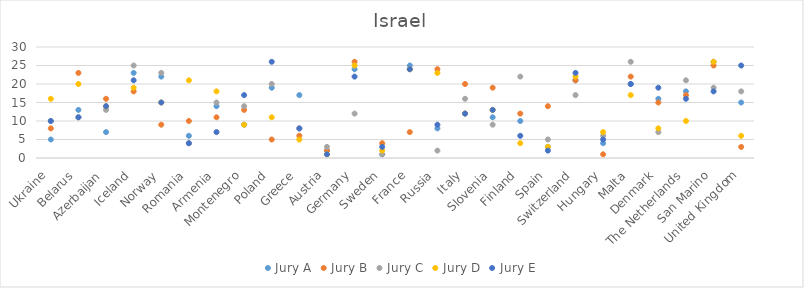
| Category | Jury A | Jury B | Jury C | Jury D | Jury E |
|---|---|---|---|---|---|
| Ukraine | 5 | 8 | 10 | 16 | 10 |
| Belarus | 13 | 23 | 11 | 20 | 11 |
| Azerbaijan | 7 | 16 | 13 | 14 | 14 |
| Iceland | 23 | 18 | 25 | 19 | 21 |
| Norway | 22 | 9 | 23 | 15 | 15 |
| Romania | 6 | 10 | 4 | 21 | 4 |
| Armenia | 14 | 11 | 15 | 18 | 7 |
| Montenegro | 9 | 13 | 14 | 9 | 17 |
| Poland | 19 | 5 | 20 | 11 | 26 |
| Greece | 17 | 6 | 8 | 5 | 8 |
| Austria | 2 | 2 | 3 | 1 | 1 |
| Germany | 24 | 26 | 12 | 25 | 22 |
| Sweden | 1 | 4 | 1 | 2 | 3 |
| France | 25 | 7 | 24 | 24 | 24 |
| Russia | 8 | 24 | 2 | 23 | 9 |
| Italy | 12 | 20 | 16 | 12 | 12 |
| Slovenia | 11 | 19 | 9 | 13 | 13 |
| Finland | 10 | 12 | 22 | 4 | 6 |
| Spain | 3 | 14 | 5 | 3 | 2 |
| Switzerland | 21 | 21 | 17 | 22 | 23 |
| Hungary | 4 | 1 | 6 | 7 | 5 |
| Malta | 20 | 22 | 26 | 17 | 20 |
| Denmark | 16 | 15 | 7 | 8 | 19 |
| The Netherlands | 18 | 17 | 21 | 10 | 16 |
| San Marino | 26 | 25 | 19 | 26 | 18 |
| United Kingdom | 15 | 3 | 18 | 6 | 25 |